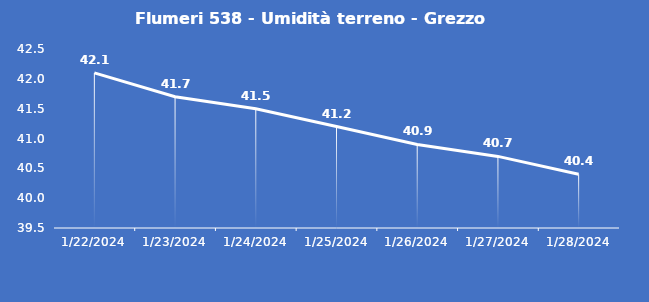
| Category | Flumeri 538 - Umidità terreno - Grezzo (%VWC) |
|---|---|
| 1/22/24 | 42.1 |
| 1/23/24 | 41.7 |
| 1/24/24 | 41.5 |
| 1/25/24 | 41.2 |
| 1/26/24 | 40.9 |
| 1/27/24 | 40.7 |
| 1/28/24 | 40.4 |